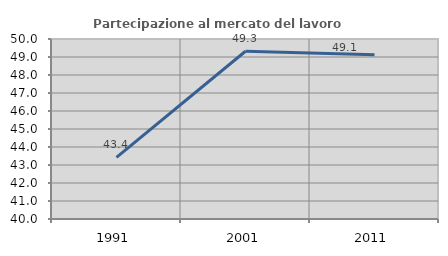
| Category | Partecipazione al mercato del lavoro  femminile |
|---|---|
| 1991.0 | 43.422 |
| 2001.0 | 49.32 |
| 2011.0 | 49.119 |